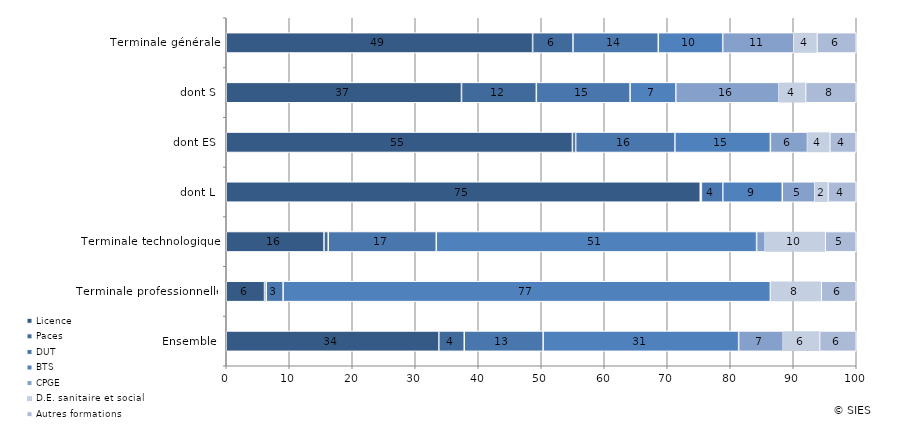
| Category | Licence | Paces | DUT | BTS | CPGE | D.E. sanitaire et social | Autres formations  |
|---|---|---|---|---|---|---|---|
| Ensemble | 33.74 | 4.04 | 12.52 | 31.03 | 7.09 | 5.76 | 5.83 |
| Terminale professionnelle | 6.08 | 0.27 | 2.68 | 77.34 | 0.09 | 7.99 | 5.55 |
| Terminale technologique | 15.51 | 0.68 | 17.15 | 50.84 | 1.38 | 9.51 | 4.93 |
| dont L | 75.24 | 0.18 | 3.39 | 9.45 | 5.18 | 2.08 | 4.48 |
| dont ES | 54.95 | 0.51 | 15.75 | 15.16 | 5.89 | 3.54 | 4.2 |
| dont S | 37.34 | 11.88 | 14.88 | 7.25 | 16.41 | 4.2 | 8.05 |
| Terminale générale | 48.63 | 6.4 | 13.55 | 10.22 | 11.28 | 3.68 | 6.25 |